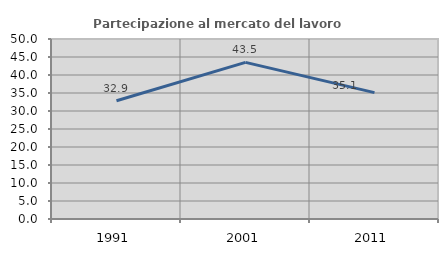
| Category | Partecipazione al mercato del lavoro  femminile |
|---|---|
| 1991.0 | 32.855 |
| 2001.0 | 43.511 |
| 2011.0 | 35.094 |